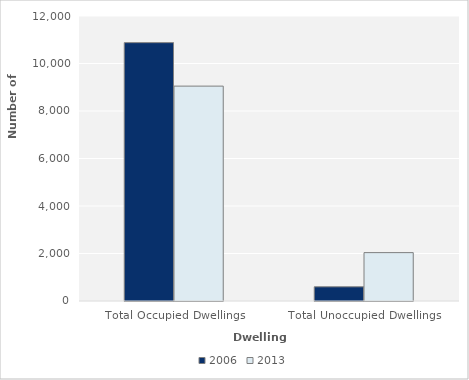
| Category | 2006 | 2013 |
|---|---|---|
| Total Occupied Dwellings | 10878 | 9048 |
| Total Unoccupied Dwellings | 597 | 2037 |